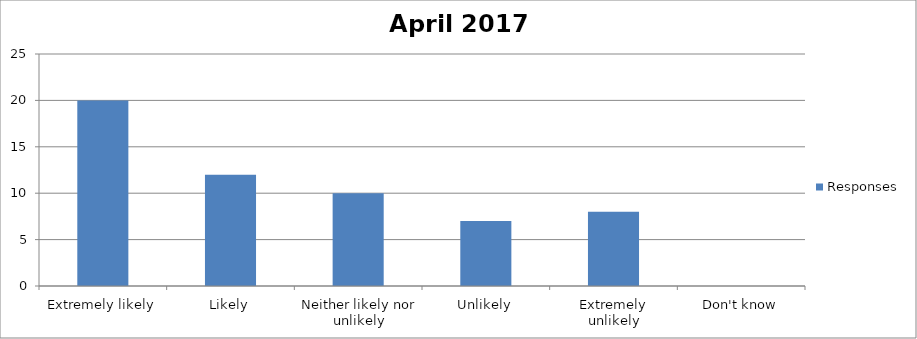
| Category | Responses |
|---|---|
| Extremely likely | 20 |
| Likely | 12 |
| Neither likely nor unlikely | 10 |
| Unlikely | 7 |
| Extremely unlikely | 8 |
| Don't know | 0 |